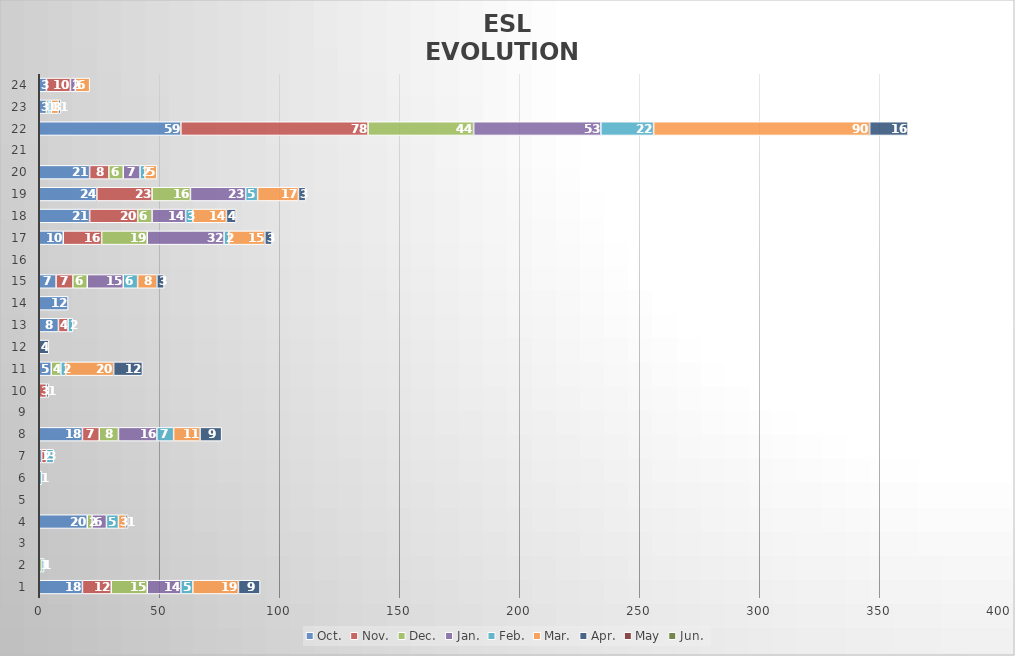
| Category | Oct. | Nov. | Dec. | Jan. | Feb. | Mar. | Apr. | May | Jun. |
|---|---|---|---|---|---|---|---|---|---|
| 1.0 | 18 | 12 | 15 | 14 | 5 | 19 | 9 | 0 | 0 |
| 2.0 | 0 | 0 | 1 | 0 | 1 | 0 | 0 | 0 | 0 |
| 3.0 | 0 | 0 | 0 | 0 | 0 | 0 | 0 | 0 | 0 |
| 4.0 | 20 | 0 | 2 | 6 | 5 | 3 | 1 | 0 | 0 |
| 5.0 | 0 | 0 | 0 | 0 | 0 | 0 | 0 | 0 | 0 |
| 6.0 | 0 | 0 | 0 | 0 | 1 | 0 | 0 | 0 | 0 |
| 7.0 | 1 | 2 | 0 | 0 | 3 | 0 | 0 | 0 | 0 |
| 8.0 | 18 | 7 | 8 | 16 | 7 | 11 | 9 | 0 | 0 |
| 9.0 | 0 | 0 | 0 | 0 | 0 | 0 | 0 | 0 | 0 |
| 10.0 | 0 | 3 | 0 | 0 | 0 | 0 | 1 | 0 | 0 |
| 11.0 | 5 | 0 | 4 | 0 | 2 | 20 | 12 | 0 | 0 |
| 12.0 | 0 | 0 | 0 | 0 | 0 | 0 | 4 | 0 | 0 |
| 13.0 | 8 | 4 | 0 | 0 | 2 | 0 | 0 | 0 | 0 |
| 14.0 | 12 | 0 | 0 | 0 | 0 | 0 | 0 | 0 | 0 |
| 15.0 | 7 | 7 | 6 | 15 | 6 | 8 | 3 | 0 | 0 |
| 16.0 | 0 | 0 | 0 | 0 | 0 | 0 | 0 | 0 | 0 |
| 17.0 | 10 | 16 | 19 | 32 | 2 | 15 | 3 | 0 | 0 |
| 18.0 | 21 | 20 | 6 | 14 | 3 | 14 | 4 | 0 | 0 |
| 19.0 | 24 | 23 | 16 | 23 | 5 | 17 | 3 | 0 | 0 |
| 20.0 | 21 | 8 | 6 | 7 | 2 | 5 | 0 | 0 | 0 |
| 21.0 | 0 | 0 | 0 | 0 | 0 | 0 | 0 | 0 | 0 |
| 22.0 | 59 | 78 | 44 | 53 | 22 | 90 | 16 | 0 | 0 |
| 23.0 | 3 | 0 | 1 | 0 | 1 | 3 | 1 | 0 | 0 |
| 24.0 | 3 | 10 | 0 | 2 | 0 | 6 | 0 | 0 | 0 |